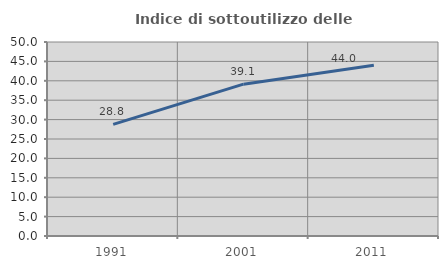
| Category | Indice di sottoutilizzo delle abitazioni  |
|---|---|
| 1991.0 | 28.753 |
| 2001.0 | 39.13 |
| 2011.0 | 44 |